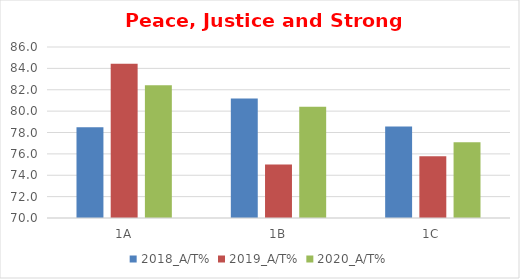
| Category | 2018_A/T% | 2019_A/T% | 2020_A/T% |
|---|---|---|---|
| 1A | 78.481 | 84.444 | 82.418 |
| 1B | 81.176 | 75 | 80.412 |
| 1C | 78.571 | 75.789 | 77.083 |